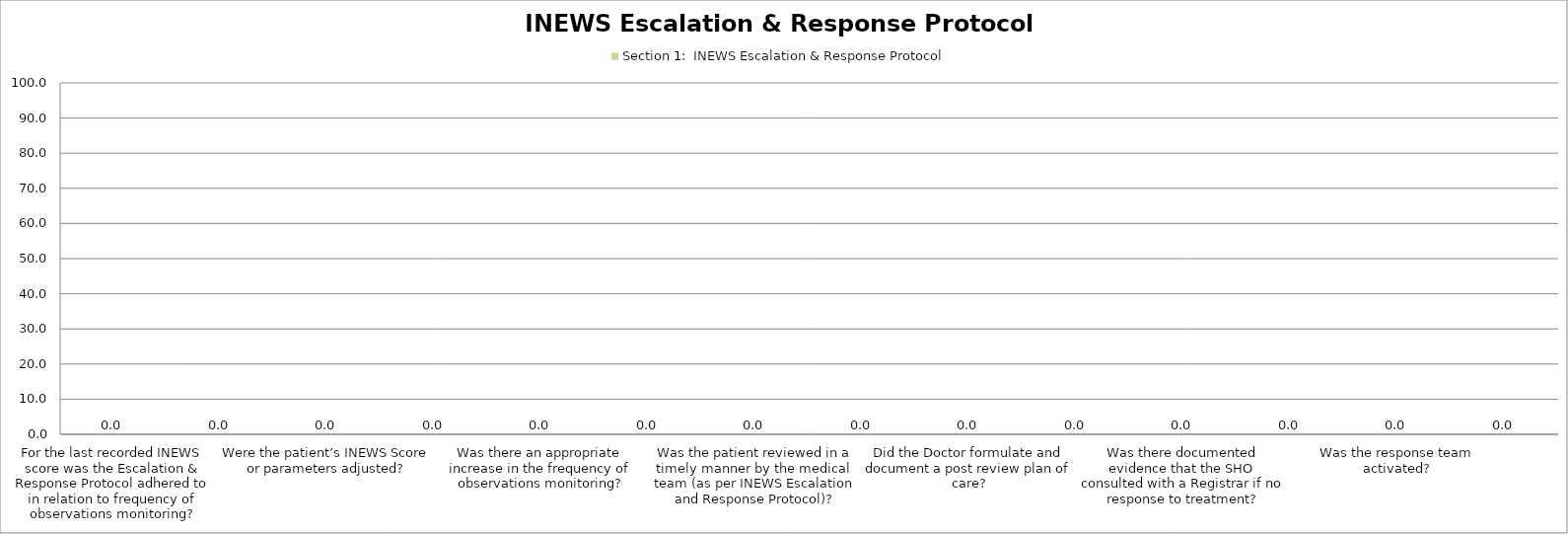
| Category | Section 1:  INEWS Escalation & Response Protocol |
|---|---|
| For the last recorded INEWS score was the Escalation & Response Protocol adhered to in relation to frequency of observations monitoring? | 0 |
| For the last recorded INEWS score was the Escalation & Response Protocol adhered to in relation to minimum alert? | 0 |
| Were the patient’s INEWS Score or parameters adjusted? | 0 |
| Was the nurse in charge informed of INEWS Score? | 0 |
| Was there an appropriate increase in the frequency of observations monitoring? | 0 |
| Was the score escalated appropriately to the medical team for scores ≥ to 3? | 0 |
| Was the patient reviewed in a timely manner by the medical team (as per INEWS Escalation and Response Protocol)? | 0 |
| Was there documented evidence of medical response to requested action or review? | 0 |
| Did the Doctor formulate and document a post review plan of care? | 0 |
| Was there documented evidence that a senior doctor was consulted when care was escalated? | 0 |
| Was there documented evidence that the SHO consulted with a Registrar if no response to treatment? | 0 |
| Was there documented evidence that a Registrar or Consultant reviewed the patient with an INEWS score ≥ 7? | 0 |
| Was the response team activated? | 0 |
| Was the patient transferred to a higher level of care where appropriate? | 0 |